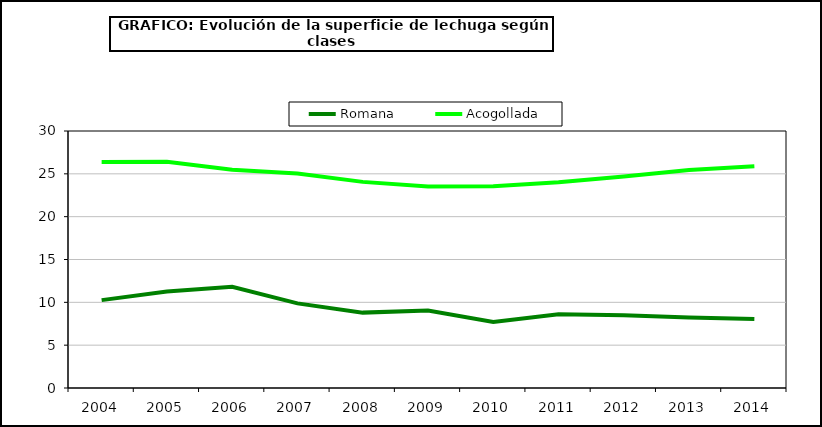
| Category | Romana | Acogollada |
|---|---|---|
| 2004.0 | 10.257 | 26.39 |
| 2005.0 | 11.263 | 26.411 |
| 2006.0 | 11.817 | 25.482 |
| 2007.0 | 9.88 | 25.033 |
| 2008.0 | 8.799 | 24.061 |
| 2009.0 | 9.045 | 23.512 |
| 2010.0 | 7.707 | 23.549 |
| 2011.0 | 8.605 | 24.015 |
| 2012.0 | 8.497 | 24.699 |
| 2013.0 | 8.23 | 25.438 |
| 2014.0 | 8.041 | 25.883 |